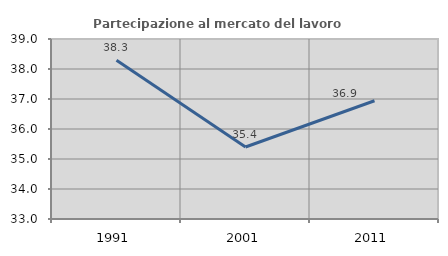
| Category | Partecipazione al mercato del lavoro  femminile |
|---|---|
| 1991.0 | 38.288 |
| 2001.0 | 35.401 |
| 2011.0 | 36.942 |